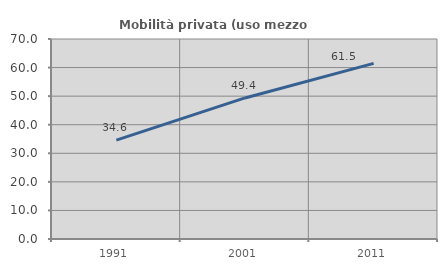
| Category | Mobilità privata (uso mezzo privato) |
|---|---|
| 1991.0 | 34.615 |
| 2001.0 | 49.371 |
| 2011.0 | 61.452 |